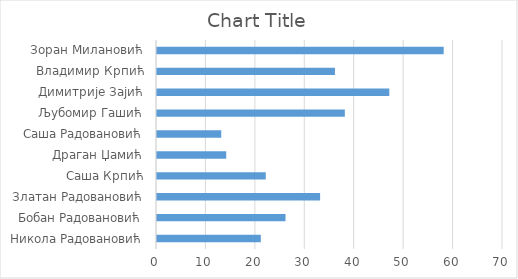
| Category | Series 0 |
|---|---|
| Никола Радовановић | 21 |
| Бобан Радовановић | 26 |
| Златан Радовановић | 33 |
| Саша Крпић | 22 |
| Драган Џамић | 14 |
| Саша Радовановић | 13 |
| Љубомир Гашић | 38 |
| Димитрије Зајић | 47 |
| Владимир Крпић | 36 |
| Зоран Милановић | 58 |